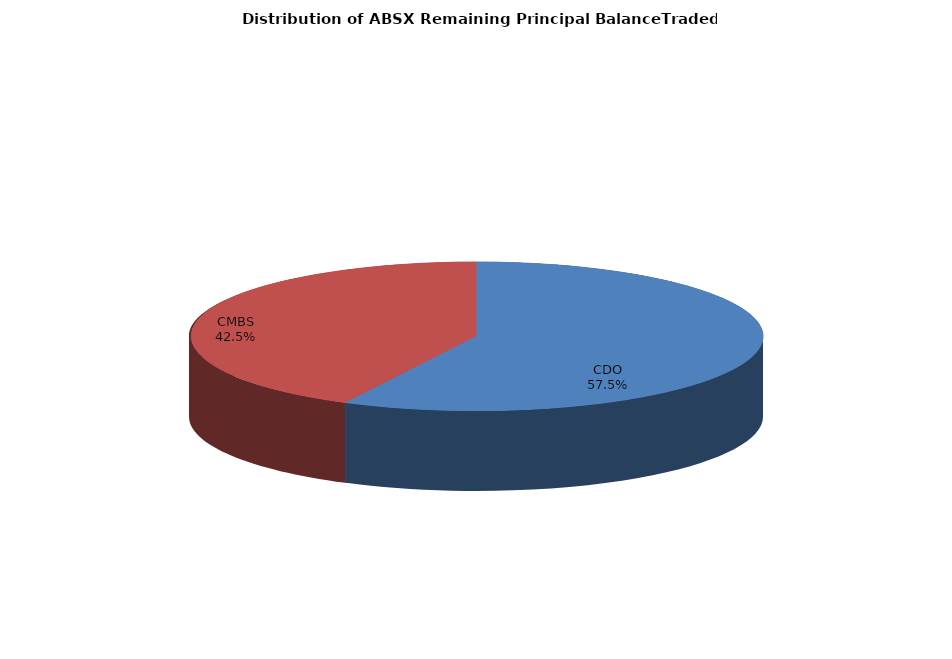
| Category | Series 0 |
|---|---|
| CDO | 2797763806.229 |
| CMBS | 2066045017.673 |